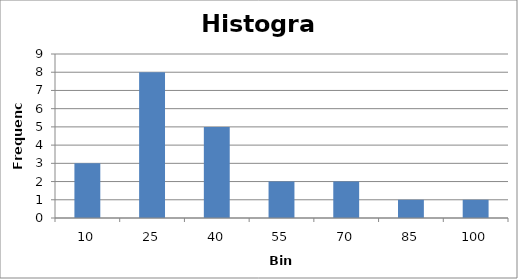
| Category | Series 0 |
|---|---|
| 10.0 | 3 |
| 25.0 | 8 |
| 40.0 | 5 |
| 55.0 | 2 |
| 70.0 | 2 |
| 85.0 | 1 |
| 100.0 | 1 |